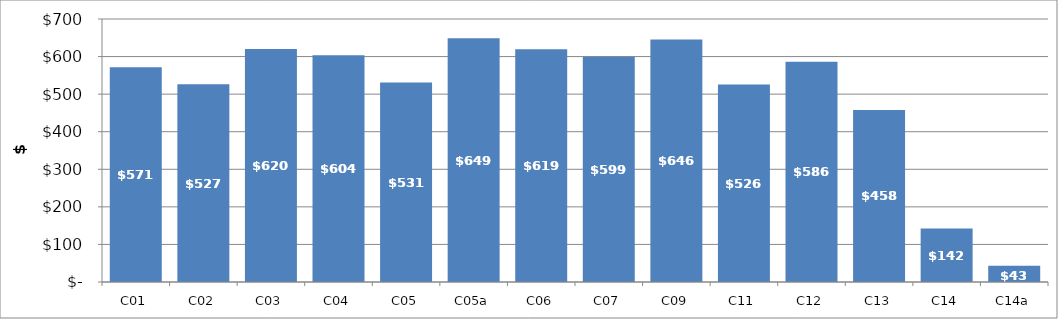
| Category | Series 0 |
|---|---|
| C01 | 571.331 |
| C02 | 526.662 |
| C03 | 620.051 |
| C04 | 603.625 |
| C05 | 531.317 |
| C05a | 648.826 |
| C06 | 619.362 |
| C07 | 599.442 |
| C09 | 645.6 |
| C11 | 525.613 |
| C12 | 586.191 |
| C13 | 457.97 |
| C14 | 142.412 |
| C14a | 43.006 |